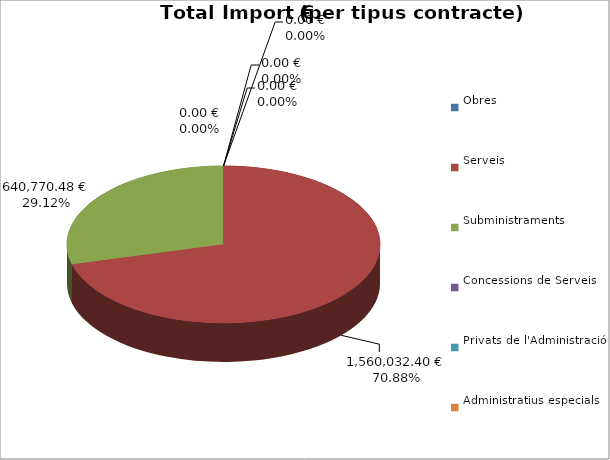
| Category | Total preu
(amb IVA) |
|---|---|
| Obres | 0 |
| Serveis | 1560032.4 |
| Subministraments | 640770.48 |
| Concessions de Serveis | 0 |
| Privats de l'Administració | 0 |
| Administratius especials | 0 |